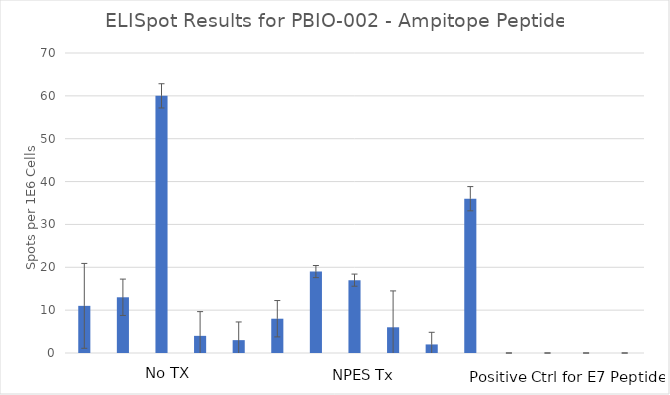
| Category | Average |
|---|---|
| No Tx | 11 |
|  | 13 |
|  | 60 |
|  | 4 |
|  | 3 |
| NPES Tx | 8 |
|  | 19 |
|  | 17 |
|  | 6 |
|  | 2 |
| Positive Control | 36 |